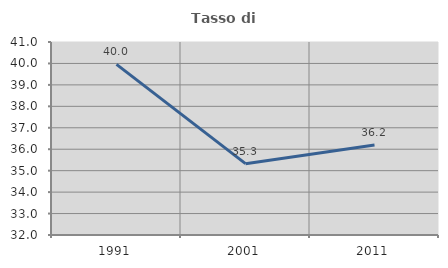
| Category | Tasso di occupazione   |
|---|---|
| 1991.0 | 39.956 |
| 2001.0 | 35.326 |
| 2011.0 | 36.192 |